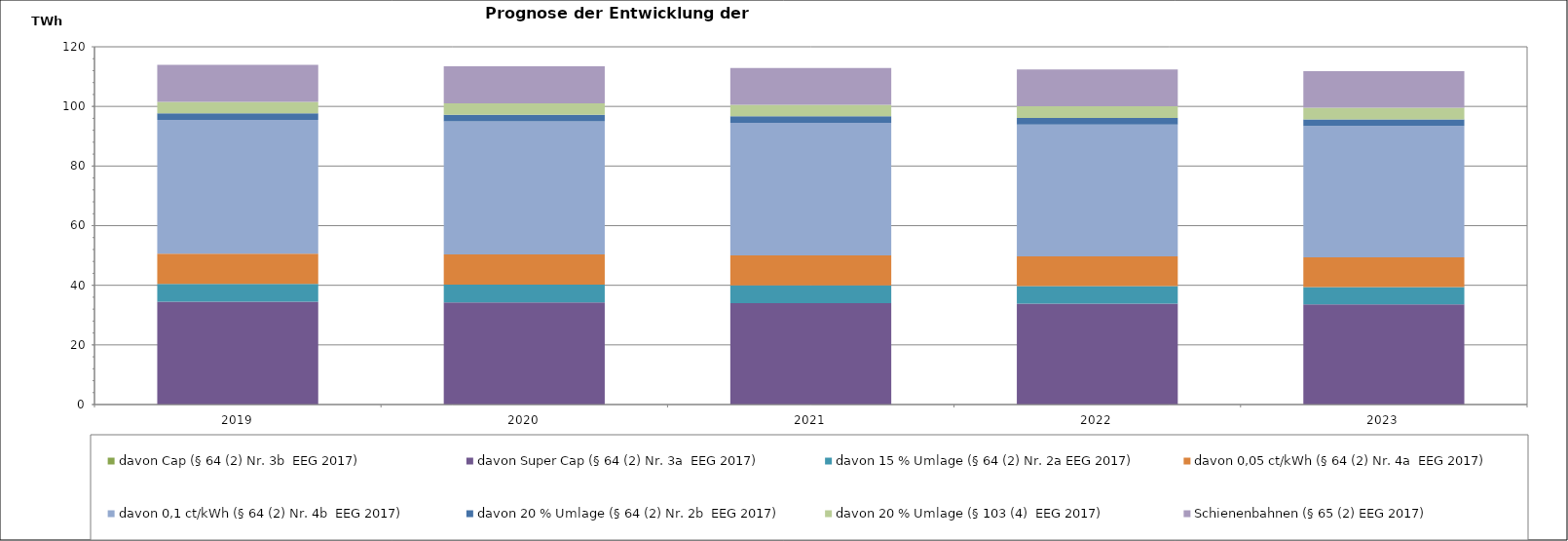
| Category |  davon Cap (§ 64 (2) Nr. 3b  EEG 2017)  |  davon Super Cap (§ 64 (2) Nr. 3a  EEG 2017)  |  davon 15 % Umlage (§ 64 (2) Nr. 2a EEG 2017)  |  davon 0,05 ct/kWh (§ 64 (2) Nr. 4a  EEG 2017)  |  davon 0,1 ct/kWh (§ 64 (2) Nr. 4b  EEG 2017)  |  davon 20 % Umlage (§ 64 (2) Nr. 2b  EEG 2017)  |  davon 20 % Umlage (§ 103 (4)  EEG 2017)  |  Schienenbahnen (§ 65 (2) EEG 2017)  |
|---|---|---|---|---|---|---|---|---|
| 2019.0 | 0 | 34.469 | 5.995 | 10.142 | 44.843 | 2.247 | 3.833 | 12.397 |
| 2020.0 | 0 | 34.256 | 5.962 | 10.098 | 44.648 | 2.235 | 3.852 | 12.37 |
| 2021.0 | 0 | 34.03 | 5.924 | 10.056 | 44.46 | 2.221 | 3.869 | 12.349 |
| 2022.0 | 0 | 33.802 | 5.886 | 10.011 | 44.262 | 2.207 | 3.886 | 12.327 |
| 2023.0 | 0 | 33.574 | 5.848 | 9.965 | 44.059 | 2.192 | 3.904 | 12.3 |